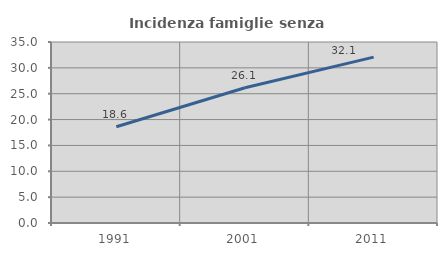
| Category | Incidenza famiglie senza nuclei |
|---|---|
| 1991.0 | 18.605 |
| 2001.0 | 26.147 |
| 2011.0 | 32.075 |